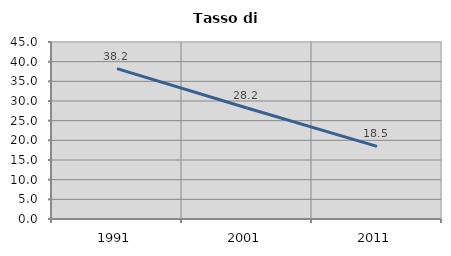
| Category | Tasso di disoccupazione   |
|---|---|
| 1991.0 | 38.242 |
| 2001.0 | 28.209 |
| 2011.0 | 18.462 |